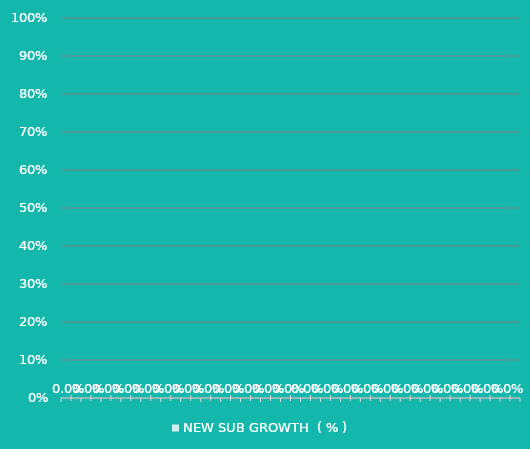
| Category | NEW SUB GROWTH  ( % ) |
|---|---|
|  | 0 |
|  | 0 |
|  | 0 |
|  | 0 |
|  | 0 |
|  | 0 |
|  | 0 |
|  | 0 |
|  | 0 |
|  | 0 |
|  | 0 |
|  | 0 |
|  | 0 |
|  | 0 |
|  | 0 |
|  | 0 |
|  | 0 |
|  | 0 |
|  | 0 |
|  | 0 |
|  | 0 |
|  | 0 |
|  | 0 |